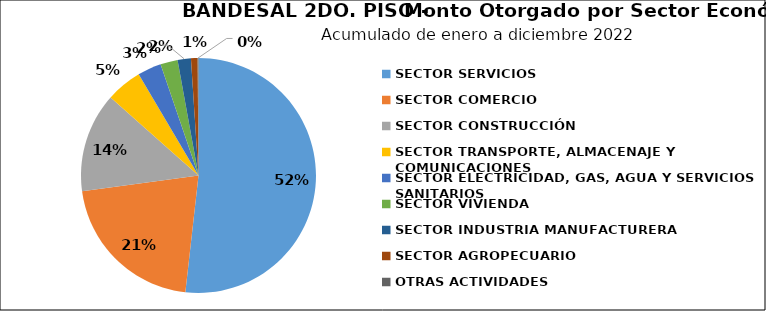
| Category | Monto | Créditos |
|---|---|---|
| SECTOR SERVICIOS | 118.313 | 2384 |
| SECTOR COMERCIO | 48.145 | 2594 |
| SECTOR CONSTRUCCIÓN | 31.268 | 321 |
| SECTOR TRANSPORTE, ALMACENAJE Y COMUNICACIONES | 11.313 | 342 |
| SECTOR ELECTRICIDAD, GAS, AGUA Y SERVICIOS SANITARIOS | 7.474 | 26 |
| SECTOR VIVIENDA | 5.423 | 231 |
| SECTOR INDUSTRIA MANUFACTURERA | 4.178 | 38 |
| SECTOR AGROPECUARIO | 2.072 | 74 |
| OTRAS ACTIVIDADES | 0.275 | 14 |